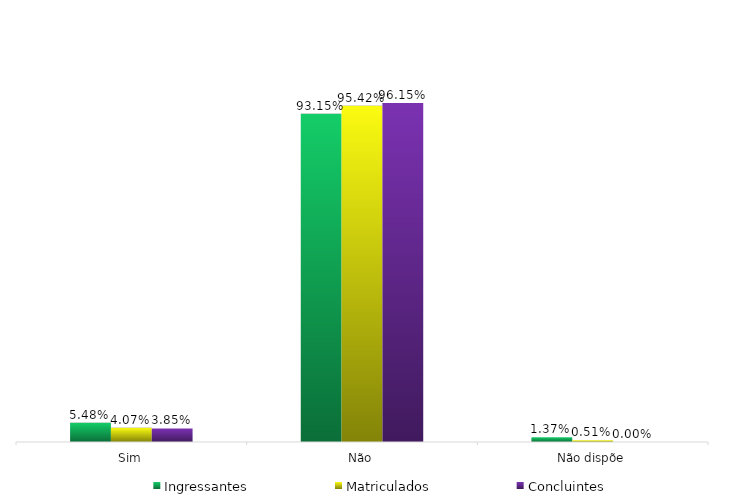
| Category | Ingressantes | Matriculados | Concluintes |
|---|---|---|---|
| Sim | 0.055 | 0.041 | 0.038 |
| Não | 0.932 | 0.954 | 0.962 |
| Não dispõe | 0.014 | 0.005 | 0 |